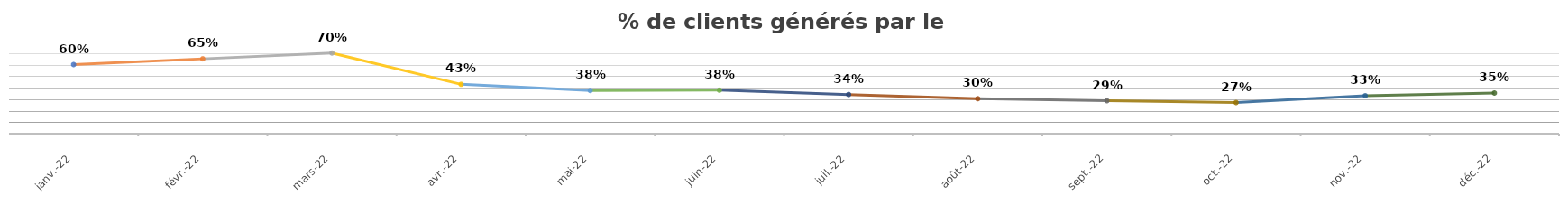
| Category | Series 0 |
|---|---|
| 2022-01-18 | 0.6 |
| 2022-02-18 | 0.65 |
| 2022-03-18 | 0.7 |
| 2022-04-18 | 0.429 |
| 2022-05-18 | 0.375 |
| 2022-06-18 | 0.378 |
| 2022-07-18 | 0.34 |
| 2022-08-18 | 0.304 |
| 2022-09-18 | 0.286 |
| 2022-10-18 | 0.27 |
| 2022-11-18 | 0.329 |
| 2022-12-18 | 0.353 |